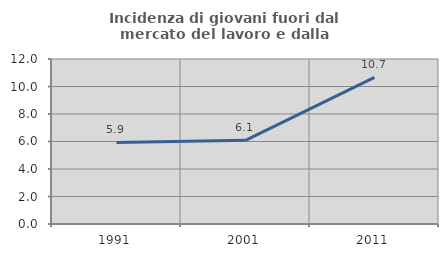
| Category | Incidenza di giovani fuori dal mercato del lavoro e dalla formazione  |
|---|---|
| 1991.0 | 5.934 |
| 2001.0 | 6.087 |
| 2011.0 | 10.667 |